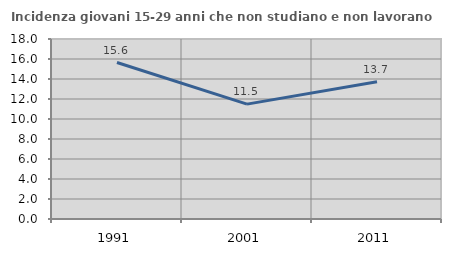
| Category | Incidenza giovani 15-29 anni che non studiano e non lavorano  |
|---|---|
| 1991.0 | 15.645 |
| 2001.0 | 11.489 |
| 2011.0 | 13.722 |